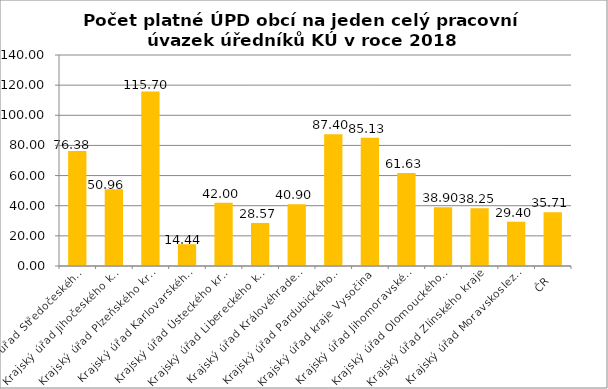
| Category | Počet platné ÚPD obcí na jeden celý pracovní úvazek úředníků KÚ |
|---|---|
| Krajský úřad Středočeského kraje | 76.38 |
| Krajský úřad Jihočeského kraje | 50.96 |
| Krajský úřad Plzeňského kraje | 115.7 |
| Krajský úřad Karlovarského kraje | 14.44 |
| Krajský úřad Ústeckého kraje | 42 |
| Krajský úřad Libereckého kraje | 28.57 |
| Krajský úřad Královéhradeckého kraje | 40.9 |
| Krajský úřad Pardubického kraje | 87.4 |
| Krajský úřad kraje Vysočina | 85.13 |
| Krajský úřad Jihomoravského kraje | 61.63 |
| Krajský úřad Olomouckého kraje | 38.9 |
| Krajský úřad Zlínského kraje | 38.25 |
| Krajský úřad Moravskoslezského kraje | 29.4 |
| ČR | 35.71 |